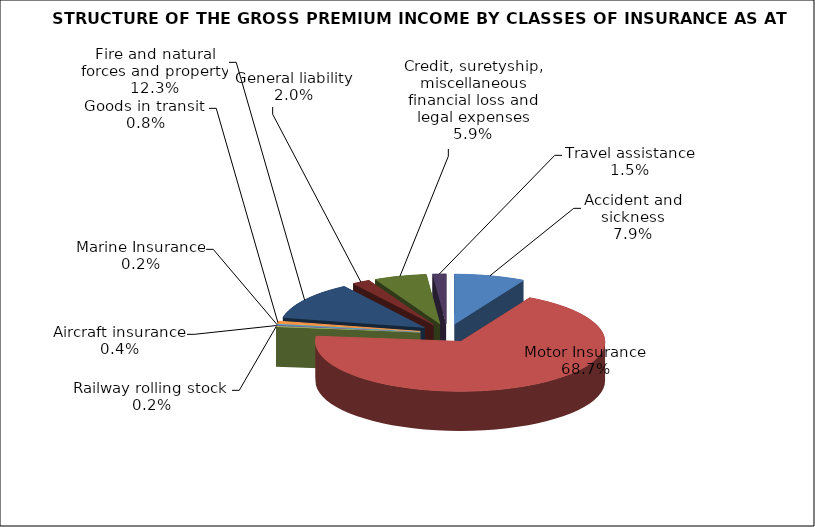
| Category | Accident and sickness |
|---|---|
| Accident and sickness | 0.079 |
| Motor Insurance | 0.687 |
| Railway rolling stock  | 0.002 |
| Aircraft insurance | 0.004 |
| Marine Insurance | 0.002 |
| Goods in transit  | 0.008 |
| Fire and natural forces and property | 0.123 |
| General liability | 0.02 |
| Credit, suretyship, miscellaneous financial loss and legal expenses | 0.059 |
| Travel assistance | 0.015 |